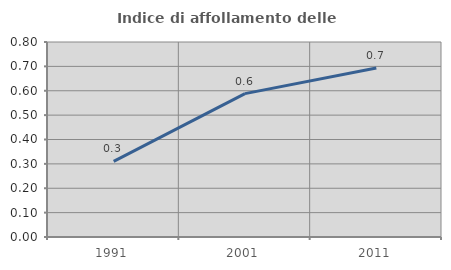
| Category | Indice di affollamento delle abitazioni  |
|---|---|
| 1991.0 | 0.31 |
| 2001.0 | 0.588 |
| 2011.0 | 0.694 |